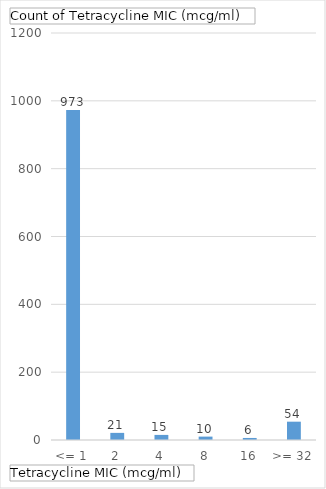
| Category | Total |
|---|---|
| <= 1 | 973 |
| 2 | 21 |
| 4 | 15 |
| 8 | 10 |
| 16 | 6 |
| >= 32 | 54 |